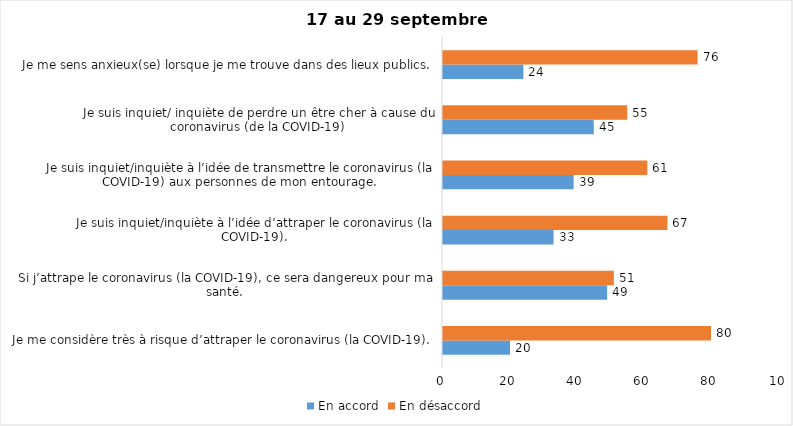
| Category | En accord | En désaccord |
|---|---|---|
| Je me considère très à risque d’attraper le coronavirus (la COVID-19). | 20 | 80 |
| Si j’attrape le coronavirus (la COVID-19), ce sera dangereux pour ma santé. | 49 | 51 |
| Je suis inquiet/inquiète à l’idée d’attraper le coronavirus (la COVID-19). | 33 | 67 |
| Je suis inquiet/inquiète à l’idée de transmettre le coronavirus (la COVID-19) aux personnes de mon entourage. | 39 | 61 |
| Je suis inquiet/ inquiète de perdre un être cher à cause du coronavirus (de la COVID-19) | 45 | 55 |
| Je me sens anxieux(se) lorsque je me trouve dans des lieux publics. | 24 | 76 |